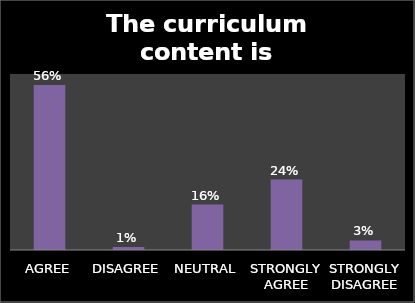
| Category | Series 0 |
|---|---|
| AGREE | 0.562 |
| DISAGREE | 0.01 |
| NEUTRAL | 0.155 |
| STRONGLY AGREE | 0.24 |
| STRONGLY DISAGREE | 0.032 |